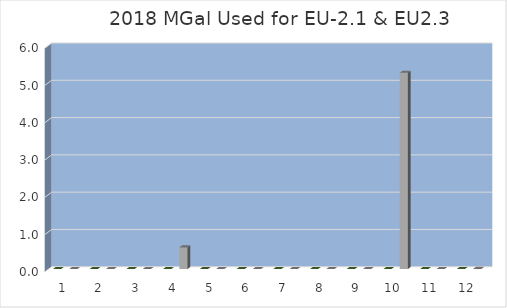
| Category | Series 0 | Series 1 | Series 2 |
|---|---|---|---|
| 0 | 0 |  | 0 |
| 1 | 0 |  | 0 |
| 2 | 0 |  | 0 |
| 3 | 0 |  | 0.58 |
| 4 | 0 |  | 0 |
| 5 | 0 |  | 0 |
| 6 | 0 |  | 0 |
| 7 | 0 |  | 0 |
| 8 | 0 |  | 0 |
| 9 | 0 |  | 5.262 |
| 10 | 0 |  | 0 |
| 11 | 0 |  | 0.003 |